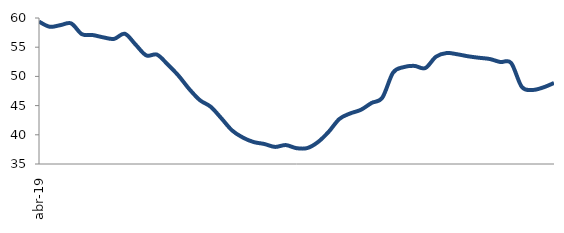
| Category | Series 0 |
|---|---|
| 2019-04-01 | 59.379 |
| 2019-05-01 | 58.501 |
| 2019-06-01 | 58.778 |
| 2019-07-01 | 59.07 |
| 2019-08-01 | 57.226 |
| 2019-09-01 | 57.084 |
| 2019-10-01 | 56.682 |
| 2019-11-01 | 56.425 |
| 2019-12-01 | 57.298 |
| 2020-01-01 | 55.449 |
| 2020-02-01 | 53.592 |
| 2020-03-01 | 53.724 |
| 2020-04-01 | 52.032 |
| 2020-05-01 | 50.132 |
| 2020-06-01 | 47.839 |
| 2020-07-01 | 45.923 |
| 2020-08-01 | 44.807 |
| 2020-09-01 | 42.819 |
| 2020-10-01 | 40.739 |
| 2020-11-01 | 39.526 |
| 2020-12-01 | 38.764 |
| 2021-01-01 | 38.426 |
| 2021-02-01 | 37.926 |
| 2021-03-01 | 38.241 |
| 2021-04-01 | 37.709 |
| 2021-05-01 | 37.728 |
| 2021-06-01 | 38.756 |
| 2021-07-01 | 40.518 |
| 2021-08-01 | 42.719 |
| 2021-09-01 | 43.654 |
| 2021-10-01 | 44.278 |
| 2021-11-01 | 45.454 |
| 2021-12-01 | 46.366 |
| 2022-01-01 | 50.644 |
| 2022-02-01 | 51.594 |
| 2022-03-01 | 51.797 |
| 2022-04-01 | 51.424 |
| 2022-05-01 | 53.368 |
| 2022-06-01 | 54.005 |
| 2022-07-01 | 53.784 |
| 2022-08-01 | 53.439 |
| 2022-09-01 | 53.193 |
| 2022-10-01 | 52.983 |
| 2022-11-01 | 52.462 |
| 2022-12-01 | 52.307 |
| 2023-01-01 | 48.201 |
| 2023-02-01 | 47.68 |
| 2023-03-01 | 48.113 |
| 2023-04-01 | 48.873 |